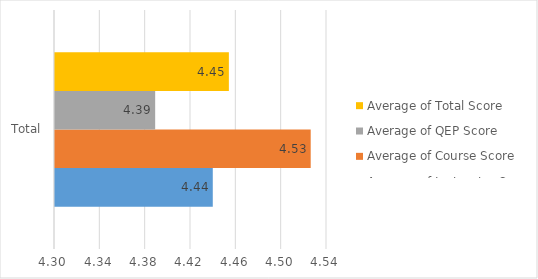
| Category | Average of Instructor Score | Average of Course Score | Average of QEP Score | Average of Total Score |
|---|---|---|---|---|
| Total | 4.439 | 4.526 | 4.388 | 4.453 |